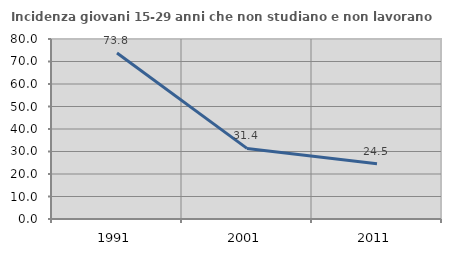
| Category | Incidenza giovani 15-29 anni che non studiano e non lavorano  |
|---|---|
| 1991.0 | 73.786 |
| 2001.0 | 31.373 |
| 2011.0 | 24.514 |